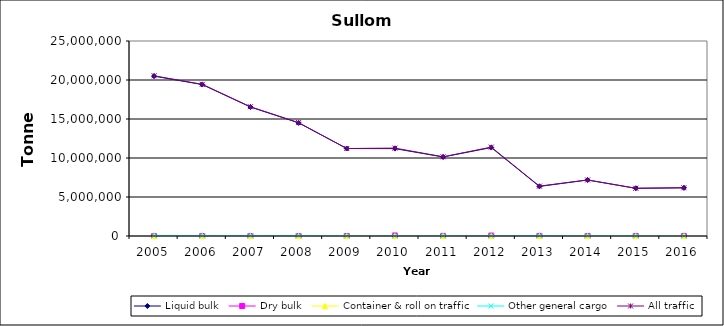
| Category | Liquid bulk | Dry bulk | Container & roll on traffic | Other general cargo | All traffic |
|---|---|---|---|---|---|
| 2005.0 | 20494000 | 0 | 0 | 47000 | 20541000 |
| 2006.0 | 19417000 | 0 | 0 | 30000 | 19447000 |
| 2007.0 | 16537000 | 0 | 0 | 36000 | 16573000 |
| 2008.0 | 14507000 | 0 | 0 | 32000 | 14539000 |
| 2009.0 | 11216595 | 0 | 0 | 0 | 11216595 |
| 2010.0 | 11202000 | 69000 | 0 | 0 | 11270000 |
| 2011.0 | 10134000 | 12000 | 0 | 7000 | 10153000 |
| 2012.0 | 11339000 | 57000 | 0 | 2000 | 11398000 |
| 2013.0 | 6357000 | 13000 | 0 | 24000 | 6394000 |
| 2014.0 | 7180000 | 0 | 0 | 5000 | 7185000 |
| 2015.0 | 6114000 | 5000 | 0 | 0 | 6120000 |
| 2016.0 | 6179000 | 4000 | 0 | 0 | 6183000 |